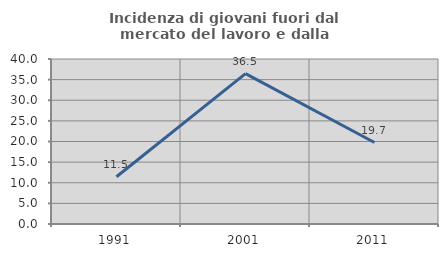
| Category | Incidenza di giovani fuori dal mercato del lavoro e dalla formazione  |
|---|---|
| 1991.0 | 11.458 |
| 2001.0 | 36.471 |
| 2011.0 | 19.745 |